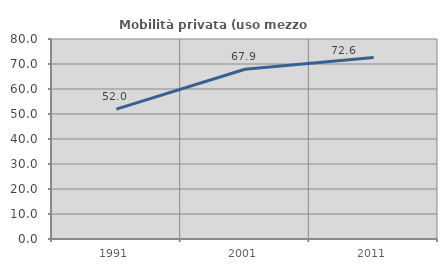
| Category | Mobilità privata (uso mezzo privato) |
|---|---|
| 1991.0 | 51.957 |
| 2001.0 | 67.919 |
| 2011.0 | 72.564 |